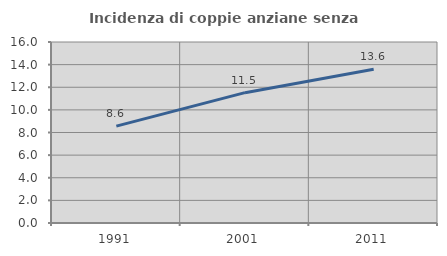
| Category | Incidenza di coppie anziane senza figli  |
|---|---|
| 1991.0 | 8.56 |
| 2001.0 | 11.521 |
| 2011.0 | 13.593 |